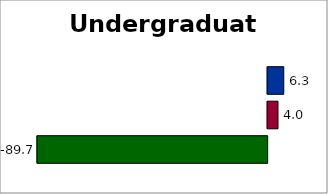
| Category | State | SREB states | 50 states and D.C. |
|---|---|---|---|
| 0 | -89.697 | 4.025 | 6.272 |